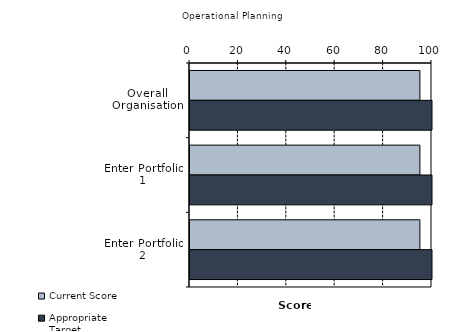
| Category | Current Score | Appropriate Target |
|---|---|---|
| Overall Organisation | 95 | 100 |
| Enter Portfolio 1 | 95 | 100 |
| Enter Portfolio 2 | 95 | 100 |